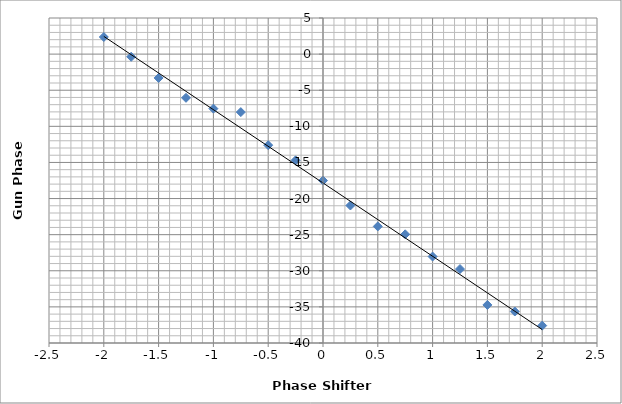
| Category | Series 0 |
|---|---|
| 2.0 | -37.59 |
| 1.75 | -35.64 |
| 1.5 | -34.73 |
| 1.25 | -29.76 |
| 1.0 | -28.03 |
| 0.75 | -24.95 |
| 0.5 | -23.86 |
| 0.25 | -20.96 |
| 0.0 | -17.51 |
| -0.25 | -14.71 |
| -0.5 | -12.61 |
| -0.75 | -8.03 |
| -1.0 | -7.55 |
| -1.25 | -6.05 |
| -1.5 | -3.3 |
| -1.75 | -0.37 |
| -2.0 | 2.37 |